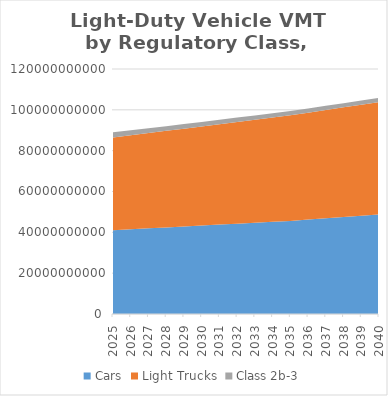
| Category | Cars | Light Trucks | Class 2b-3 |
|---|---|---|---|
| 2025.0 | 41025371029.895 | 45445446010.502 | 2534726969.692 |
| 2026.0 | 41489570259.272 | 46058548805.349 | 2462197466.154 |
| 2027.0 | 41953769488.649 | 46671651600.195 | 2389667962.615 |
| 2028.0 | 42417968718.026 | 47284754395.042 | 2317138459.077 |
| 2029.0 | 42882167947.403 | 47897857189.888 | 2244608955.538 |
| 2030.0 | 43346367176.78 | 48510959984.735 | 2172079452 |
| 2031.0 | 43796191477.823 | 49151974852.383 | 2158735956.658 |
| 2032.0 | 44246015778.865 | 49792989720.03 | 2145392461.316 |
| 2033.0 | 44695840079.908 | 50434004587.678 | 2132048965.974 |
| 2034.0 | 45145664380.95 | 51075019455.325 | 2118705470.631 |
| 2035.0 | 45595488681.993 | 51716034322.973 | 2105361975.289 |
| 2036.0 | 46235093808.973 | 52374404230.559 | 2092293201.631 |
| 2037.0 | 46874698935.954 | 53032774138.145 | 2079224427.974 |
| 2038.0 | 47514304062.934 | 53691144045.731 | 2066155654.316 |
| 2039.0 | 48153909189.915 | 54349513953.316 | 2053086880.658 |
| 2040.0 | 48793514316.895 | 55007883860.902 | 2040018107 |